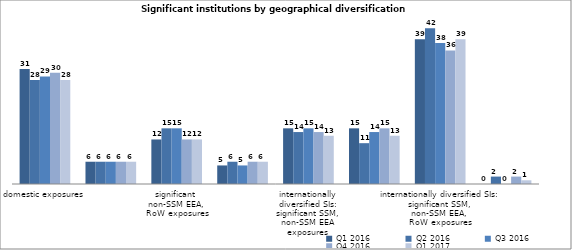
| Category | Q1 2016 | Q2 2016 | Q3 2016 | Q4 2016 | Q1 2017 |
|---|---|---|---|---|---|
| domestic exposures | 31 | 28 | 29 | 30 | 28 |
| significant SSM
(non-domestic) exposures | 6 | 6 | 6 | 6 | 6 |
| significant 
non-SSM EEA, 
RoW exposures | 12 | 15 | 15 | 12 | 12 |
| internationally
diversified SIs:
significant SSM
exposures | 5 | 6 | 5 | 6 | 6 |
| internationally
diversified SIs:
significant SSM,
non-SSM EEA
exposures | 15 | 14 | 15 | 14 | 13 |
| internationally diversified SIs:
significant SSM,
RoW exposures | 15 | 11 | 14 | 15 | 13 |
| internationally diversified SIs:
significant SSM,
non-SSM EEA, 
RoW exposures | 39 | 42 | 38 | 36 | 39 |
| without geographical focus | 0 | 2 | 0 | 2 | 1 |